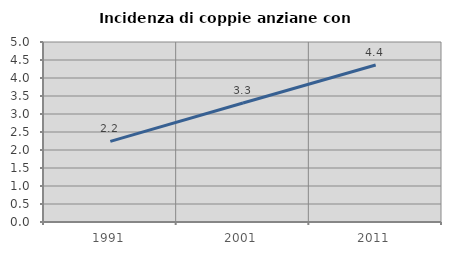
| Category | Incidenza di coppie anziane con figli |
|---|---|
| 1991.0 | 2.239 |
| 2001.0 | 3.305 |
| 2011.0 | 4.361 |